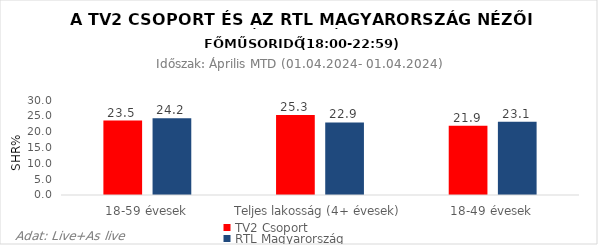
| Category | TV2 Csoport | RTL Magyarország |
|---|---|---|
| 18-59 évesek | 23.5 | 24.2 |
| Teljes lakosság (4+ évesek) | 25.3 | 22.9 |
| 18-49 évesek | 21.9 | 23.1 |